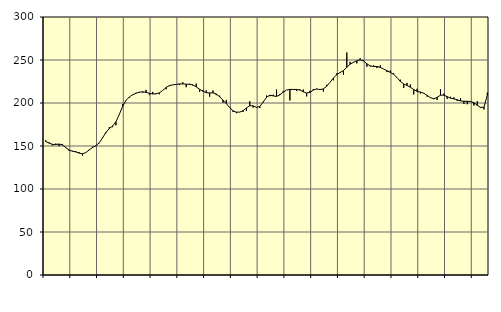
| Category | Piggar | Series 1 |
|---|---|---|
| nan | 156.8 | 155.26 |
| 87.0 | 154.3 | 153.41 |
| 87.0 | 150.8 | 151.91 |
| 87.0 | 152.7 | 151.8 |
| nan | 149.8 | 152.28 |
| 88.0 | 152.4 | 151.2 |
| 88.0 | 147.9 | 148.25 |
| 88.0 | 144.5 | 145.29 |
| nan | 144.4 | 143.92 |
| 89.0 | 144.2 | 143.1 |
| 89.0 | 142.8 | 141.74 |
| 89.0 | 138.8 | 140.97 |
| nan | 142.5 | 142.31 |
| 90.0 | 145.8 | 145.43 |
| 90.0 | 149.2 | 148.23 |
| 90.0 | 149.6 | 150.35 |
| nan | 153.2 | 153.68 |
| 91.0 | 159.7 | 159.4 |
| 91.0 | 164.8 | 165.78 |
| 91.0 | 171.8 | 170.29 |
| nan | 171.9 | 173.19 |
| 92.0 | 174.1 | 178.11 |
| 92.0 | 186.4 | 186.65 |
| 92.0 | 198.6 | 196.1 |
| nan | 203.3 | 203.06 |
| 93.0 | 206.2 | 206.97 |
| 93.0 | 210 | 209.58 |
| 93.0 | 211.8 | 211.34 |
| nan | 212 | 212.65 |
| 94.0 | 212 | 213.04 |
| 94.0 | 215.2 | 212.36 |
| 94.0 | 209.2 | 211.29 |
| nan | 212.9 | 210.49 |
| 95.0 | 211.2 | 210.64 |
| 95.0 | 210.2 | 211.81 |
| 95.0 | 214.6 | 214.59 |
| nan | 216 | 218.09 |
| 96.0 | 219.6 | 220.32 |
| 96.0 | 221.2 | 221.05 |
| 96.0 | 221.5 | 221.63 |
| nan | 220.9 | 222.18 |
| 97.0 | 224.1 | 222.21 |
| 97.0 | 218.4 | 221.85 |
| 97.0 | 222.4 | 221.75 |
| nan | 220.2 | 221.01 |
| 98.0 | 222.6 | 218.71 |
| 98.0 | 213 | 215.97 |
| 98.0 | 215.1 | 213.63 |
| nan | 214.7 | 212.01 |
| 99.0 | 207.4 | 211.71 |
| 99.0 | 214.5 | 211.8 |
| 99.0 | 209.1 | 210.44 |
| nan | 208.5 | 207.21 |
| 0.0 | 200.4 | 203.34 |
| 0.0 | 203.6 | 199.32 |
| 0.0 | 195 | 194.69 |
| nan | 189.6 | 190.92 |
| 1.0 | 188.1 | 189.34 |
| 1.0 | 189.3 | 189.43 |
| 1.0 | 189.6 | 191.1 |
| nan | 190.8 | 194.32 |
| 2.0 | 202 | 196.85 |
| 2.0 | 194.7 | 196.7 |
| 2.0 | 195.3 | 194.89 |
| nan | 194.2 | 195.93 |
| 3.0 | 201.6 | 201.01 |
| 3.0 | 208.7 | 206.61 |
| 3.0 | 207.9 | 209.14 |
| nan | 209.6 | 208.24 |
| 4.0 | 215.6 | 207.68 |
| 4.0 | 210.5 | 209.52 |
| 4.0 | 214 | 212.63 |
| nan | 215 | 215.05 |
| 5.0 | 203 | 215.85 |
| 5.0 | 216.2 | 215.75 |
| 5.0 | 213.9 | 215.72 |
| nan | 215.7 | 215.07 |
| 6.0 | 215.7 | 213.04 |
| 6.0 | 207.7 | 211.53 |
| 6.0 | 214.2 | 212.37 |
| nan | 216.3 | 215.06 |
| 7.0 | 216.8 | 216.28 |
| 7.0 | 216 | 215.62 |
| 7.0 | 213.3 | 216.43 |
| nan | 221.2 | 219.5 |
| 8.0 | 224.1 | 224.13 |
| 8.0 | 226.4 | 228.98 |
| 8.0 | 234.5 | 232.95 |
| nan | 235.8 | 235.44 |
| 9.0 | 232.9 | 237.74 |
| 9.0 | 258.7 | 241.49 |
| 9.0 | 247.8 | 245.15 |
| nan | 247.6 | 247.31 |
| 10.0 | 246 | 249.04 |
| 10.0 | 252 | 250.22 |
| 10.0 | 249.8 | 248.94 |
| nan | 242.2 | 245.57 |
| 11.0 | 242.6 | 243.1 |
| 11.0 | 243.7 | 242.53 |
| 11.0 | 240.6 | 242.41 |
| nan | 243.7 | 241.48 |
| 12.0 | 239.5 | 239.56 |
| 12.0 | 236 | 237.58 |
| 12.0 | 237.7 | 235.59 |
| nan | 234.4 | 233.32 |
| 13.0 | 229.4 | 229.61 |
| 13.0 | 227.1 | 225.04 |
| 13.0 | 217.5 | 222.15 |
| nan | 223.4 | 220.4 |
| 14.0 | 221.6 | 218.4 |
| 14.0 | 210 | 215.69 |
| 14.0 | 216.5 | 213.48 |
| nan | 211.1 | 212.73 |
| 15.0 | 211.7 | 211.35 |
| 15.0 | 207.5 | 208.83 |
| 15.0 | 206.6 | 206.21 |
| nan | 204.4 | 204.87 |
| 16.0 | 203.4 | 206.66 |
| 16.0 | 215.9 | 209.04 |
| 16.0 | 210.9 | 209.13 |
| nan | 204.8 | 207.38 |
| 17.0 | 207.2 | 205.66 |
| 17.0 | 206.6 | 204.81 |
| 17.0 | 202.4 | 203.75 |
| nan | 205.7 | 202.42 |
| 18.0 | 199 | 202.07 |
| 18.0 | 198.6 | 201.99 |
| 18.0 | 202 | 201.7 |
| nan | 197.1 | 200.42 |
| 19.0 | 202 | 197.29 |
| 19.0 | 194.1 | 194.85 |
| 19.0 | 192.5 | 195.15 |
| nan | 212 | 209.25 |